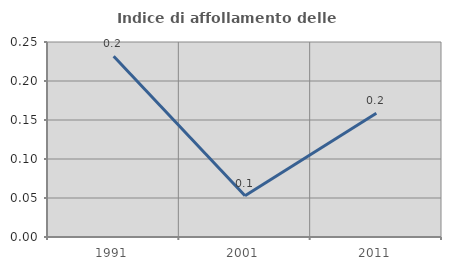
| Category | Indice di affollamento delle abitazioni  |
|---|---|
| 1991.0 | 0.232 |
| 2001.0 | 0.053 |
| 2011.0 | 0.159 |